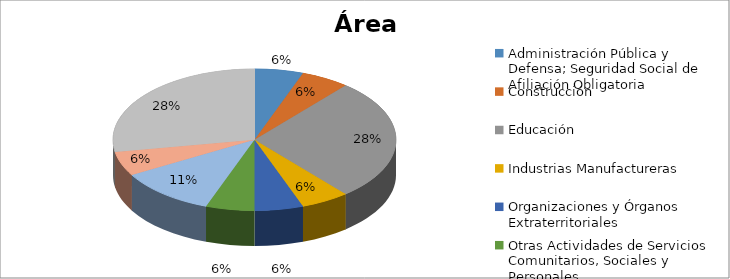
| Category | Series 0 |
|---|---|
| Administración Pública y Defensa; Seguridad Social de Afiliación Obligatoria | 0.056 |
| Construcción | 0.056 |
| Educación | 0.278 |
| Industrias Manufactureras | 0.056 |
| Organizaciones y Órganos Extraterritoriales | 0.056 |
| Otras Actividades de Servicios Comunitarios, Sociales y Personales | 0.056 |
| Servicios Sociales y de Salud | 0.111 |
| Suministros de Electricidad, Gas y Agua | 0.056 |
| SIN RESPUESTA | 0.278 |